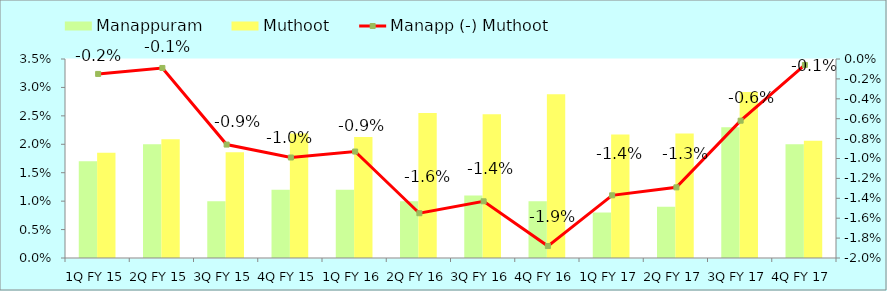
| Category | Manappuram | Muthoot |
|---|---|---|
| 1Q FY 15 | 0.017 | 0.018 |
| 2Q FY 15 | 0.02 | 0.021 |
| 3Q FY 15 | 0.01 | 0.019 |
| 4Q FY 15 | 0.012 | 0.022 |
| 1Q FY 16 | 0.012 | 0.021 |
| 2Q FY 16 | 0.01 | 0.026 |
| 3Q FY 16 | 0.011 | 0.025 |
| 4Q FY 16 | 0.01 | 0.029 |
| 1Q FY 17 | 0.008 | 0.022 |
| 2Q FY 17 | 0.009 | 0.022 |
| 3Q FY 17 | 0.023 | 0.029 |
| 4Q FY 17 | 0.02 | 0.021 |